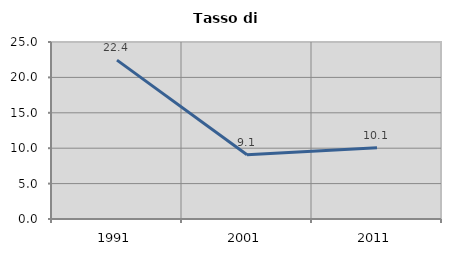
| Category | Tasso di disoccupazione   |
|---|---|
| 1991.0 | 22.438 |
| 2001.0 | 9.063 |
| 2011.0 | 10.056 |